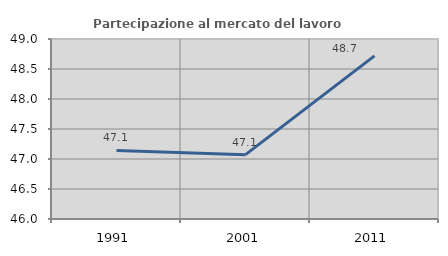
| Category | Partecipazione al mercato del lavoro  femminile |
|---|---|
| 1991.0 | 47.142 |
| 2001.0 | 47.072 |
| 2011.0 | 48.719 |